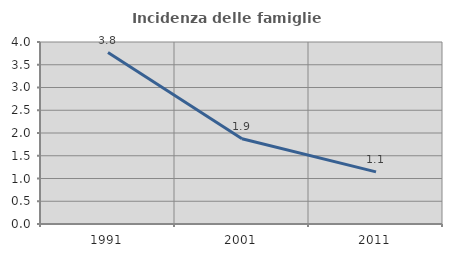
| Category | Incidenza delle famiglie numerose |
|---|---|
| 1991.0 | 3.767 |
| 2001.0 | 1.872 |
| 2011.0 | 1.146 |